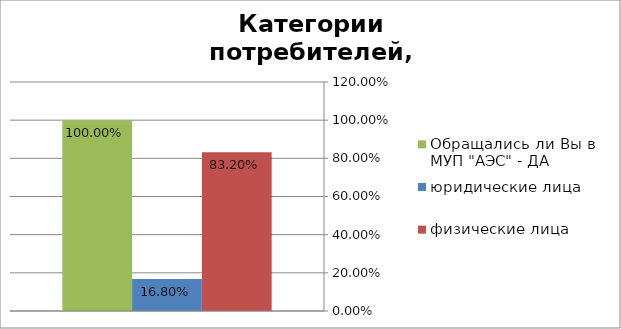
| Category | Обращались ли Вы в МУП "АЭС" - ДА   | юридические лица | физические лица |
|---|---|---|---|
| да | 1 | 0.168 | 0.832 |